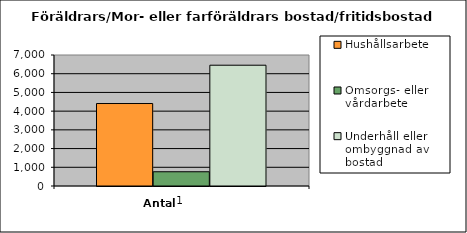
| Category | Hushållsarbete | Omsorgs- eller vårdarbete | Underhåll eller ombyggnad av bostad |
|---|---|---|---|
| 0 | 4407 | 761 | 6454 |